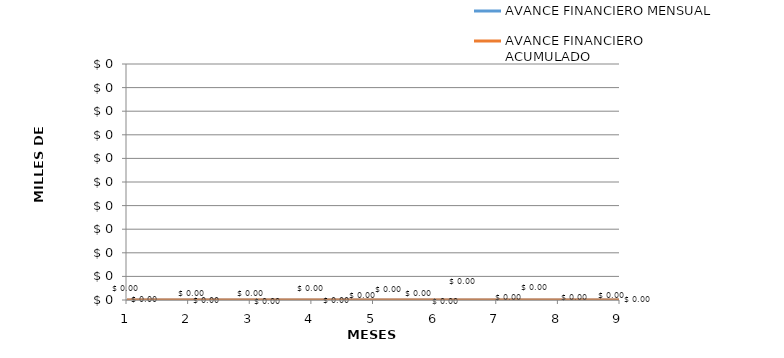
| Category | AVANCE FINANCIERO MENSUAL | AVANCE FINANCIERO ACUMULADO |
|---|---|---|
| 0 | 0 | 0 |
| 1 | 0 | 0 |
| 2 | 0 | 0 |
| 3 | 0 | 0 |
| 4 | 0 | 0 |
| 5 | 0 | 0 |
| 6 | 0 | 0 |
| 7 | 0 | 0 |
| 8 | 0 | 0 |